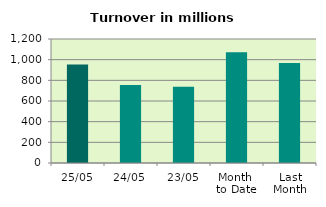
| Category | Series 0 |
|---|---|
| 25/05 | 952.708 |
| 24/05 | 754.394 |
| 23/05 | 738.383 |
| Month 
to Date | 1070.677 |
| Last
Month | 968.247 |